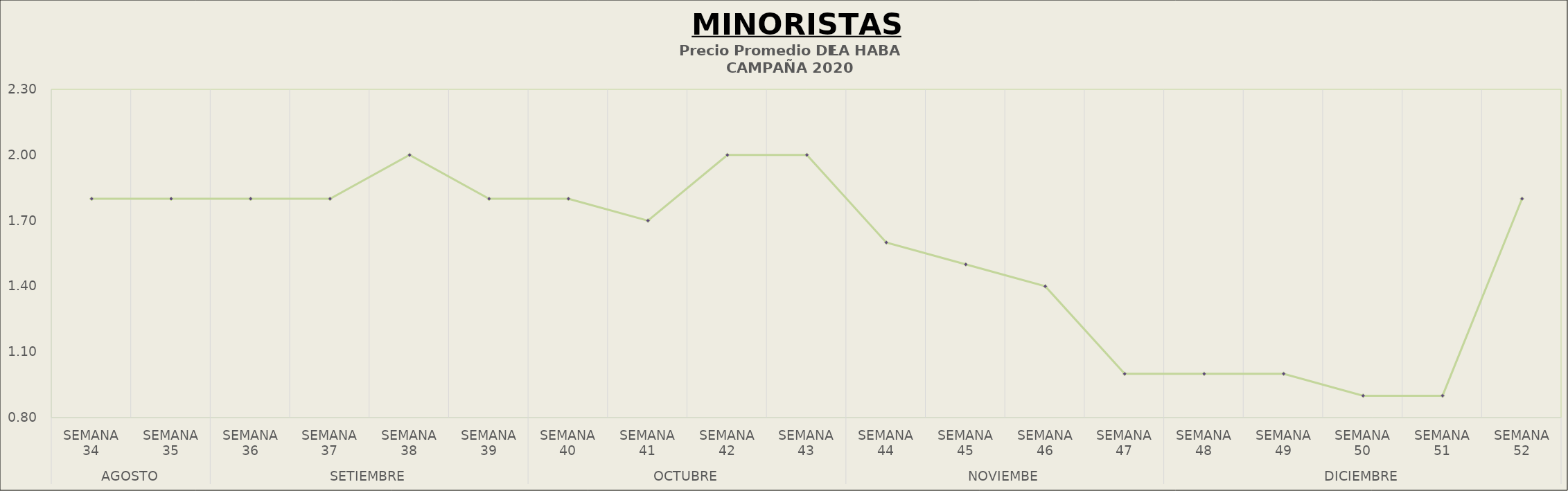
| Category | Precio Promedio ( S/.x Kg.) |
|---|---|
| 0 | 1.8 |
| 1 | 1.8 |
| 2 | 1.8 |
| 3 | 1.8 |
| 4 | 2 |
| 5 | 1.8 |
| 6 | 1.8 |
| 7 | 1.7 |
| 8 | 2 |
| 9 | 2 |
| 10 | 1.6 |
| 11 | 1.5 |
| 12 | 1.4 |
| 13 | 1 |
| 14 | 1 |
| 15 | 1 |
| 16 | 0.9 |
| 17 | 0.9 |
| 18 | 1.8 |